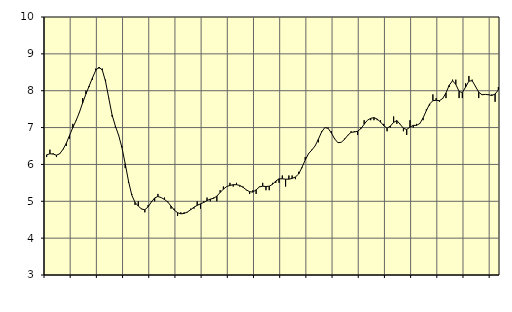
| Category | Piggar | Byggverksamhet, SNI 41-431 |
|---|---|---|
| nan | 6.2 | 6.26 |
| 87.0 | 6.4 | 6.29 |
| 87.0 | 6.3 | 6.28 |
| 87.0 | 6.2 | 6.25 |
| nan | 6.3 | 6.29 |
| 88.0 | 6.4 | 6.41 |
| 88.0 | 6.5 | 6.57 |
| 88.0 | 6.7 | 6.79 |
| nan | 7.1 | 7 |
| 89.0 | 7.2 | 7.19 |
| 89.0 | 7.4 | 7.41 |
| 89.0 | 7.8 | 7.67 |
| nan | 8 | 7.91 |
| 90.0 | 8.1 | 8.13 |
| 90.0 | 8.3 | 8.35 |
| 90.0 | 8.6 | 8.55 |
| nan | 8.6 | 8.64 |
| 91.0 | 8.6 | 8.56 |
| 91.0 | 8.3 | 8.25 |
| 91.0 | 7.8 | 7.79 |
| nan | 7.3 | 7.34 |
| 92.0 | 7 | 7.04 |
| 92.0 | 6.8 | 6.79 |
| 92.0 | 6.5 | 6.46 |
| nan | 5.9 | 6.02 |
| 93.0 | 5.5 | 5.55 |
| 93.0 | 5.2 | 5.17 |
| 93.0 | 4.9 | 4.97 |
| nan | 5 | 4.87 |
| 94.0 | 4.8 | 4.79 |
| 94.0 | 4.7 | 4.77 |
| 94.0 | 4.9 | 4.85 |
| nan | 5 | 4.98 |
| 95.0 | 5 | 5.09 |
| 95.0 | 5.2 | 5.13 |
| 95.0 | 5.1 | 5.1 |
| nan | 5.1 | 5.05 |
| 96.0 | 5 | 4.98 |
| 96.0 | 4.8 | 4.87 |
| 96.0 | 4.8 | 4.76 |
| nan | 4.6 | 4.69 |
| 97.0 | 4.7 | 4.66 |
| 97.0 | 4.7 | 4.67 |
| 97.0 | 4.7 | 4.71 |
| nan | 4.8 | 4.77 |
| 98.0 | 4.8 | 4.84 |
| 98.0 | 5 | 4.89 |
| 98.0 | 4.8 | 4.93 |
| nan | 5 | 4.97 |
| 99.0 | 5.1 | 5.02 |
| 99.0 | 5 | 5.06 |
| 99.0 | 5.1 | 5.08 |
| nan | 5 | 5.14 |
| 0.0 | 5.3 | 5.24 |
| 0.0 | 5.4 | 5.33 |
| 0.0 | 5.4 | 5.4 |
| nan | 5.5 | 5.43 |
| 1.0 | 5.4 | 5.45 |
| 1.0 | 5.5 | 5.45 |
| 1.0 | 5.4 | 5.43 |
| nan | 5.4 | 5.38 |
| 2.0 | 5.3 | 5.31 |
| 2.0 | 5.2 | 5.26 |
| 2.0 | 5.3 | 5.25 |
| nan | 5.2 | 5.31 |
| 3.0 | 5.4 | 5.39 |
| 3.0 | 5.5 | 5.41 |
| 3.0 | 5.3 | 5.4 |
| nan | 5.3 | 5.41 |
| 4.0 | 5.5 | 5.46 |
| 4.0 | 5.5 | 5.55 |
| 4.0 | 5.5 | 5.61 |
| nan | 5.7 | 5.61 |
| 5.0 | 5.4 | 5.6 |
| 5.0 | 5.7 | 5.6 |
| 5.0 | 5.7 | 5.62 |
| nan | 5.6 | 5.66 |
| 6.0 | 5.8 | 5.74 |
| 6.0 | 5.9 | 5.92 |
| 6.0 | 6.2 | 6.12 |
| nan | 6.3 | 6.29 |
| 7.0 | 6.4 | 6.39 |
| 7.0 | 6.5 | 6.5 |
| 7.0 | 6.6 | 6.68 |
| nan | 6.9 | 6.88 |
| 8.0 | 7 | 7 |
| 8.0 | 7 | 6.98 |
| 8.0 | 6.9 | 6.85 |
| nan | 6.7 | 6.69 |
| 9.0 | 6.6 | 6.59 |
| 9.0 | 6.6 | 6.6 |
| 9.0 | 6.7 | 6.68 |
| nan | 6.8 | 6.79 |
| 10.0 | 6.9 | 6.87 |
| 10.0 | 6.9 | 6.88 |
| 10.0 | 6.8 | 6.9 |
| nan | 7 | 6.97 |
| 11.0 | 7.2 | 7.09 |
| 11.0 | 7.2 | 7.2 |
| 11.0 | 7.2 | 7.25 |
| nan | 7.2 | 7.27 |
| 12.0 | 7.2 | 7.23 |
| 12.0 | 7.2 | 7.15 |
| 12.0 | 7.1 | 7.05 |
| nan | 6.9 | 6.98 |
| 13.0 | 7 | 7.04 |
| 13.0 | 7.3 | 7.14 |
| 13.0 | 7.1 | 7.19 |
| nan | 7.1 | 7.09 |
| 14.0 | 6.9 | 6.98 |
| 14.0 | 6.8 | 6.95 |
| 14.0 | 7.2 | 7.01 |
| nan | 7 | 7.06 |
| 15.0 | 7.1 | 7.06 |
| 15.0 | 7.1 | 7.11 |
| 15.0 | 7.2 | 7.26 |
| nan | 7.5 | 7.46 |
| 16.0 | 7.6 | 7.64 |
| 16.0 | 7.9 | 7.73 |
| 16.0 | 7.8 | 7.74 |
| nan | 7.7 | 7.73 |
| 17.0 | 7.8 | 7.79 |
| 17.0 | 7.8 | 7.94 |
| 17.0 | 8.1 | 8.15 |
| nan | 8.3 | 8.27 |
| 18.0 | 8.3 | 8.17 |
| 18.0 | 7.8 | 7.98 |
| 18.0 | 7.8 | 7.95 |
| nan | 8.2 | 8.1 |
| 19.0 | 8.4 | 8.26 |
| 19.0 | 8.3 | 8.27 |
| 19.0 | 8.1 | 8.12 |
| nan | 7.8 | 7.96 |
| 20.0 | 7.9 | 7.89 |
| 20.0 | 7.9 | 7.9 |
| 20.0 | 7.9 | 7.89 |
| nan | 7.9 | 7.87 |
| 21.0 | 7.7 | 7.91 |
| 21.0 | 8.1 | 8.02 |